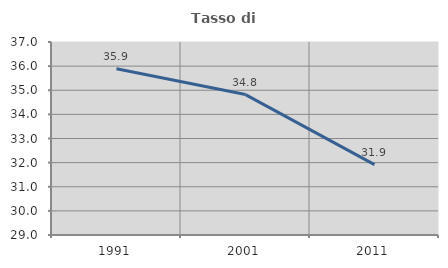
| Category | Tasso di occupazione   |
|---|---|
| 1991.0 | 35.889 |
| 2001.0 | 34.82 |
| 2011.0 | 31.918 |